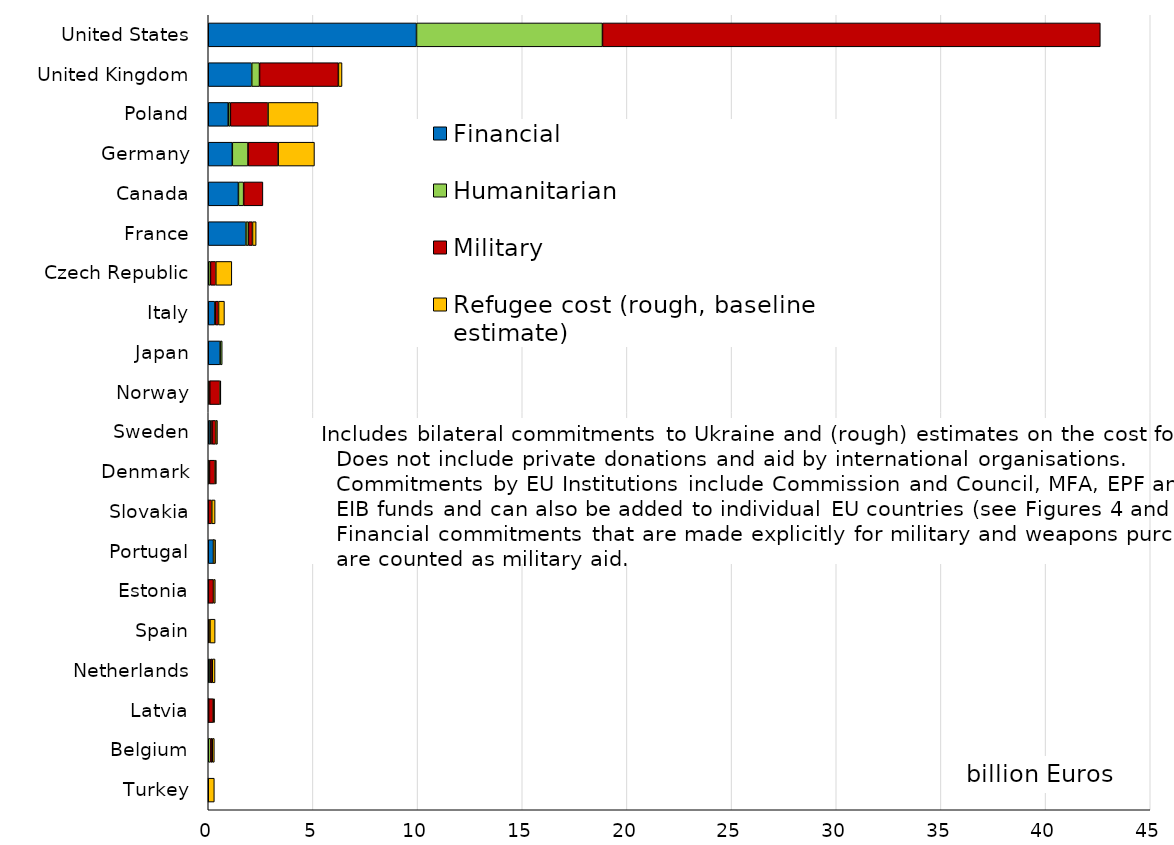
| Category | Financial | Humanitarian | Military | Refugee cost (rough, baseline estimate) |
|---|---|---|---|---|
| United States | 9.949 | 8.884 | 23.782 | 0 |
| United Kingdom | 2.077 | 0.373 | 3.768 | 0.173 |
| Poland | 0.953 | 0.103 | 1.8 | 2.389 |
| Germany | 1.15 | 0.75 | 1.44 | 1.734 |
| Canada | 1.441 | 0.25 | 0.919 | 0 |
| France | 1.8 | 0.119 | 0.194 | 0.176 |
| Czech Republic | 0 | 0.104 | 0.256 | 0.766 |
| Italy | 0.31 | 0.031 | 0.15 | 0.283 |
| Japan | 0.568 | 0.098 | 0 | 0 |
| Norway | 0.034 | 0.035 | 0.494 | 0.039 |
| Sweden | 0.091 | 0.085 | 0.182 | 0.082 |
| Denmark | 0.02 | 0.037 | 0.269 | 0.062 |
| Slovakia | 0 | 0.005 | 0.164 | 0.16 |
| Portugal | 0.25 | 0.001 | 0.009 | 0.091 |
| Estonia | 0 | 0.005 | 0.245 | 0.088 |
| Spain | 0 | 0.044 | 0.037 | 0.248 |
| Netherlands | 0.08 | 0.027 | 0.084 | 0.134 |
| Latvia | 0.015 | 0.001 | 0.219 | 0.069 |
| Belgium | 0 | 0.116 | 0.076 | 0.098 |
| Turkey | 0 | 0 | 0 | 0.29 |